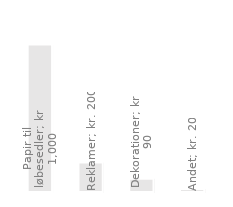
| Category | Årsudgifter |
|---|---|
| Papir til løbesedler | 1000 |
| Reklamer | 200 |
| Dekorationer | 90 |
| Andet | 20 |